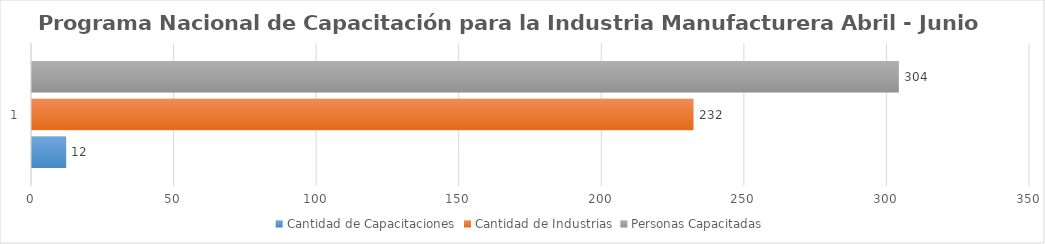
| Category | Cantidad de Capacitaciones | Cantidad de Industrias | Personas Capacitadas |
|---|---|---|---|
| 0 | 12 | 232 | 304 |